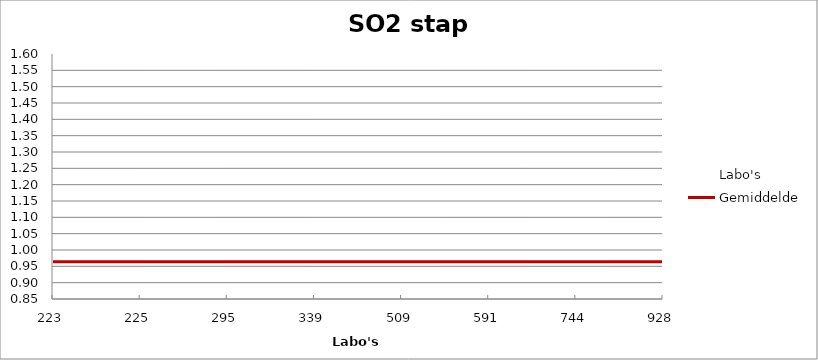
| Category | Labo's | Gemiddelde |
|---|---|---|
| 223.0 | 0.913 | 0.964 |
| 225.0 | 0.982 | 0.964 |
| 295.0 | 0.887 | 0.964 |
| 339.0 | 0.947 | 0.964 |
| 509.0 | 0.904 | 0.964 |
| 591.0 | 1.008 | 0.964 |
| 744.0 | 0.999 | 0.964 |
| 928.0 | 1.55 | 0.964 |